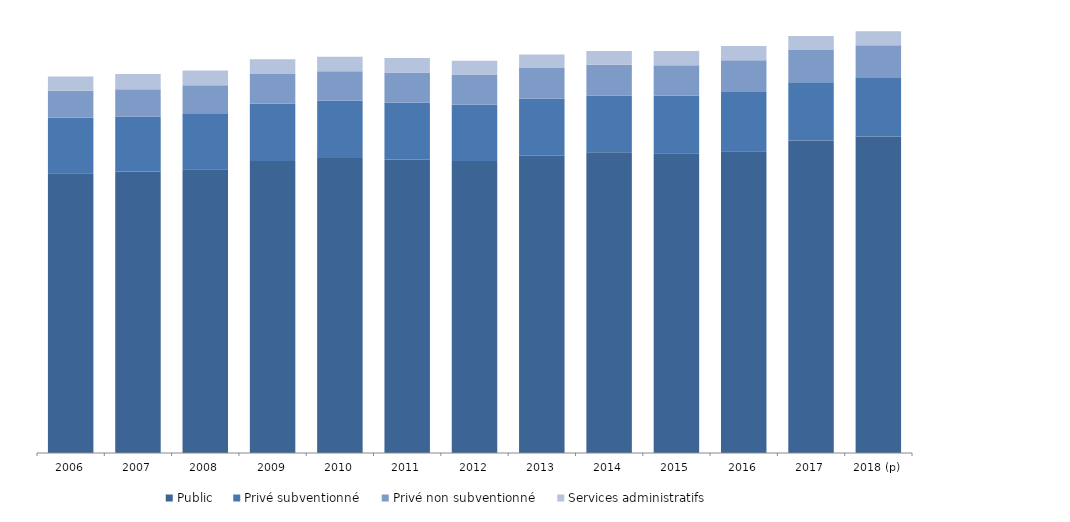
| Category | Public | Privé subventionné | Privé non subventionné | Services administratifs  |
|---|---|---|---|---|
| 2006 | 99.929 | 19.922 | 9.501 | 5.113 |
| 2007 | 100.505 | 19.709 | 9.722 | 5.393 |
| 2008 | 101.356 | 19.707 | 10.249 | 5.258 |
| 2009 | 104.321 | 20.394 | 10.662 | 5.242 |
| 2010 | 105.376 | 20.387 | 10.549 | 5.191 |
| 2011 | 104.865 | 20.302 | 10.746 | 5.142 |
| 2012 | 104.302 | 20.158 | 10.687 | 4.904 |
| 2013 | 106.198 | 20.421 | 10.846 | 4.812 |
| 2014 | 107.408 | 20.265 | 11.003 | 4.919 |
| 2015 | 107.064 | 20.493 | 10.91 | 5.118 |
| 2016 | 107.802 | 21.17 | 11.302 | 5.041 |
| 2017 | 111.576 | 20.814 | 11.544 | 4.968 |
| 2018 (p) | 112.991 | 20.904 | 11.709 | 5.06 |